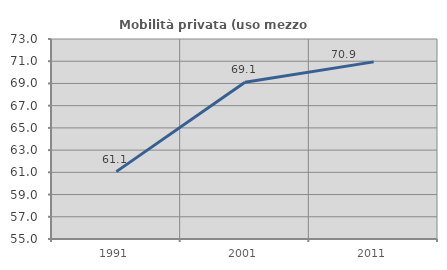
| Category | Mobilità privata (uso mezzo privato) |
|---|---|
| 1991.0 | 61.064 |
| 2001.0 | 69.104 |
| 2011.0 | 70.94 |